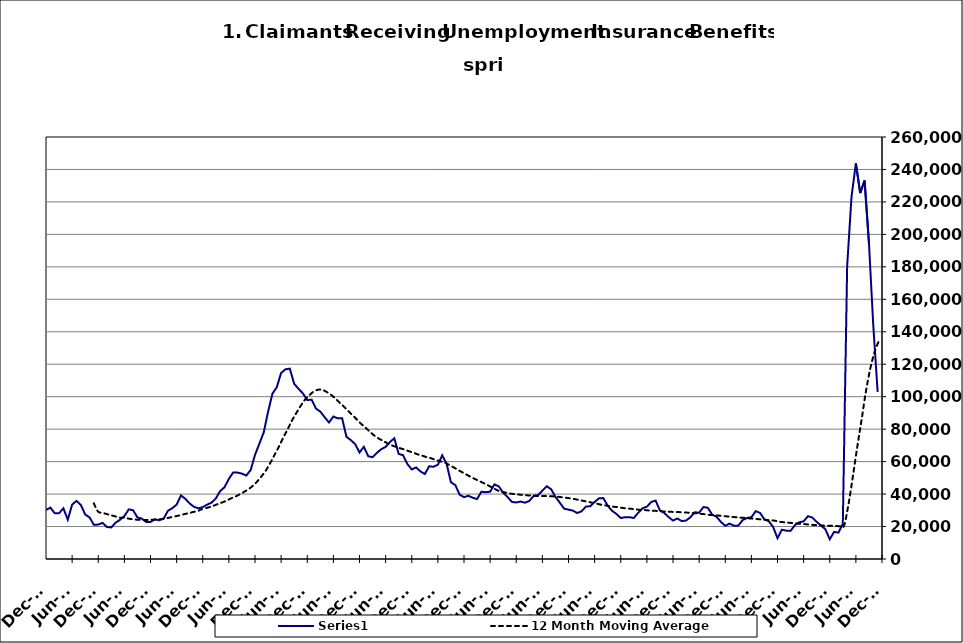
| Category | Series 0 |
|---|---|
| 2000-01-31 | 15239 |
| 2000-02-29 | 13995 |
| 2000-03-31 | 14536 |
| 2000-04-30 | 18337 |
| 2000-05-31 | 20863 |
| 2000-06-30 | 24310 |
| 2000-07-31 | 29359 |
| 2000-08-31 | 29764 |
| 2000-09-30 | 24540 |
| 2000-10-31 | 23067 |
| 2000-11-30 | 21129 |
| 2000-12-31 | 20288 |
| 2001-01-31 | 23646 |
| 2001-02-28 | 23782 |
| 2001-03-31 | 27047 |
| 2001-04-30 | 34048 |
| 2001-05-31 | 38168 |
| 2001-06-30 | 41894 |
| 2001-07-31 | 48114 |
| 2001-08-31 | 47646 |
| 2001-09-30 | 44132 |
| 2001-10-31 | 44465 |
| 2001-11-30 | 45928 |
| 2001-12-31 | 48930 |
| 2002-01-31 | 51864 |
| 2002-02-28 | 50778 |
| 2002-03-31 | 53014 |
| 2002-04-30 | 65394 |
| 2002-05-31 | 67925 |
| 2002-06-30 | 68727 |
| 2002-07-31 | 67269 |
| 2002-08-31 | 64233 |
| 2002-09-30 | 59955 |
| 2002-10-31 | 55535 |
| 2002-11-30 | 52233 |
| 2002-12-31 | 52252 |
| 2003-01-31 | 52694 |
| 2003-02-28 | 52578 |
| 2003-03-31 | 56236 |
| 2003-04-30 | 61020 |
| 2003-05-31 | 60584 |
| 2003-06-30 | 64980 |
| 2003-07-31 | 66426 |
| 2003-08-31 | 65403 |
| 2003-09-30 | 58348 |
| 2003-10-31 | 53953 |
| 2003-11-30 | 50453 |
| 2003-12-31 | 47799 |
| 2004-01-31 | 47134 |
| 2004-02-29 | 42441 |
| 2004-03-31 | 39363 |
| 2004-04-30 | 41157 |
| 2004-05-31 | 40892 |
| 2004-06-30 | 43601 |
| 2004-07-31 | 45411 |
| 2004-08-31 | 44738 |
| 2004-09-30 | 36049 |
| 2004-10-31 | 33551 |
| 2004-11-30 | 31386 |
| 2004-12-31 | 30195 |
| 2005-01-31 | 31661 |
| 2005-02-28 | 28205 |
| 2005-03-31 | 28194 |
| 2005-04-30 | 31233 |
| 2005-05-31 | 24184 |
| 2005-06-30 | 33525 |
| 2005-07-31 | 35776 |
| 2005-08-31 | 33297 |
| 2005-09-30 | 27423 |
| 2005-10-31 | 25647 |
| 2005-11-30 | 21039 |
| 2005-12-31 | 21238 |
| 2006-01-31 | 22270 |
| 2006-02-28 | 19689 |
| 2006-03-31 | 19474 |
| 2006-04-30 | 22420 |
| 2006-05-31 | 24146 |
| 2006-06-30 | 26450 |
| 2006-07-31 | 30575 |
| 2006-08-31 | 30038 |
| 2006-09-30 | 25657 |
| 2006-10-31 | 24869 |
| 2006-11-30 | 22832 |
| 2006-12-31 | 22826 |
| 2007-01-31 | 24459 |
| 2007-02-28 | 23856 |
| 2007-03-31 | 24786 |
| 2007-04-30 | 29690 |
| 2007-05-31 | 31303 |
| 2007-06-30 | 33512 |
| 2007-07-31 | 39176 |
| 2007-08-31 | 37077 |
| 2007-09-30 | 34179 |
| 2007-10-31 | 32130 |
| 2007-11-15 | 31205 |
| 2007-12-15 09:36:00 | 31973 |
| 2008-01-14 19:12:00 | 33494 |
| 2008-02-14 04:48:00 | 34694 |
| 2008-03-15 14:24:00 | 37279 |
| 2008-04-15 | 41840 |
| 2008-05-15 09:36:00 | 44245 |
| 2008-06-14 19:12:00 | 49341 |
| 2008-07-15 04:48:00 | 53353 |
| 2008-08-14 14:24:00 | 53222 |
| 2008-09-14 | 52594 |
| 2008-10-14 09:36:00 | 51417 |
| 2008-11-13 19:12:00 | 54795 |
| 2008-12-14 04:48:00 | 64139 |
| 2009-01-13 14:24:00 | 71026 |
| 2009-02-13 | 77947 |
| 2009-03-15 09:36:00 | 90649 |
| 2009-04-14 19:12:00 | 101865 |
| 2009-05-15 04:48:00 | 105867 |
| 2009-06-14 14:24:00 | 114626 |
| 2009-07-15 | 116882 |
| 2009-08-14 09:36:00 | 117270 |
| 2009-09-13 19:12:00 | 107943 |
| 2009-10-14 04:48:00 | 104849 |
| 2009-11-13 14:24:00 | 102065 |
| 2009-12-14 | 97917 |
| 2010-01-13 09:36:00 | 98175 |
| 2010-02-12 19:12:00 | 92691 |
| 2010-03-15 04:48:00 | 90832 |
| 2010-04-14 14:24:00 | 87347 |
| 2010-05-15 | 84120 |
| 2010-06-14 09:36:00 | 87787 |
| 2010-07-14 19:12:00 | 86654 |
| 2010-08-14 04:48:00 | 86789 |
| 2010-09-13 14:24:00 | 75317 |
| 2010-10-14 | 73259 |
| 2010-11-13 09:36:00 | 70783 |
| 2010-12-13 19:12:00 | 65644 |
| 2011-01-13 04:48:00 | 69106 |
| 2011-02-12 14:24:00 | 63322 |
| 2011-03-15 | 62724 |
| 2011-04-14 09:36:00 | 65434 |
| 2011-05-14 19:12:00 | 67641 |
| 2011-06-14 04:48:00 | 69087 |
| 2011-07-14 14:24:00 | 72082 |
| 2011-08-14 | 74376 |
| 2011-09-13 09:36:00 | 64739 |
| 2011-10-13 19:12:00 | 63965 |
| 2011-11-13 04:48:00 | 58496 |
| 2011-12-13 14:24:00 | 55173 |
| 2012-01-13 | 56418 |
| 2012-02-12 09:36:00 | 53942 |
| 2012-03-13 19:12:00 | 52352 |
| 2012-04-13 04:48:00 | 57118 |
| 2012-05-13 14:24:00 | 56827 |
| 2012-06-13 | 58115 |
| 2012-07-13 09:36:00 | 63863 |
| 2012-08-12 19:12:00 | 58706 |
| 2012-09-12 04:48:00 | 47243 |
| 2012-10-12 14:24:00 | 45567 |
| 2012-11-12 | 39623 |
| 2012-12-12 09:36:00 | 38101 |
| 2013-01-11 19:12:00 | 38966 |
| 2013-02-11 04:48:00 | 37746 |
| 2013-03-13 14:24:00 | 36956 |
| 2013-04-13 | 41439 |
| 2013-05-13 09:36:00 | 41162 |
| 2013-06-12 19:12:00 | 41455 |
| 2013-07-13 04:48:00 | 45989 |
| 2013-08-12 14:24:00 | 44712 |
| 2013-09-12 | 40828 |
| 2013-10-12 09:36:00 | 38185 |
| 2013-11-11 19:12:00 | 35184 |
| 2013-12-12 04:48:00 | 34824 |
| 2014-01-11 14:24:00 | 35396 |
| 2014-02-11 | 34683 |
| 2014-03-13 09:36:00 | 35748 |
| 2014-04-12 19:12:00 | 38892 |
| 2014-05-13 04:48:00 | 39325 |
| 2014-06-12 14:24:00 | 42091 |
| 2014-07-13 | 44842 |
| 2014-08-14 | 43016 |
| 2014-09-13 09:36:00 | 38304 |
| 2014-10-13 19:12:00 | 34708 |
| 2014-11-13 04:48:00 | 31017 |
| 2014-12-13 14:24:00 | 30402 |
| 2015-01-13 | 29823 |
| 2015-02-12 09:36:00 | 28333 |
| 2015-03-14 19:12:00 | 29389 |
| 2015-04-14 04:48:00 | 32293 |
| 2015-05-14 14:24:00 | 32538 |
| 2015-06-14 | 35137 |
| 2015-07-14 09:36:00 | 37398 |
| 2015-08-13 19:12:00 | 37536 |
| 2015-09-13 04:48:00 | 32808 |
| 2015-10-13 14:24:00 | 29728 |
| 2015-11-13 | 27775 |
| 2015-12-13 09:36:00 | 25227 |
| 2016-01-12 19:12:00 | 25773 |
| 2016-02-12 04:48:00 | 25758 |
| 2016-03-13 14:24:00 | 25247 |
| 2016-04-13 | 28463 |
| 2016-05-13 09:36:00 | 31210 |
| 2016-06-12 19:12:00 | 32255 |
| 2016-07-13 04:48:00 | 35088 |
| 2016-08-12 14:24:00 | 36018 |
| 2016-09-12 | 29922 |
| 2016-10-12 09:36:00 | 28368 |
| 2016-11-11 19:12:00 | 25818 |
| 2016-12-12 04:48:00 | 23690 |
| 2017-01-11 14:24:00 | 24964 |
| 2017-02-11 | 23348 |
| 2017-03-13 09:36:00 | 23685 |
| 2017-04-12 19:12:00 | 25733 |
| 2017-05-13 04:48:00 | 28796 |
| 2017-06-12 14:24:00 | 28489 |
| 2017-07-13 | 32034 |
| 2017-08-12 09:36:00 | 31539 |
| 2017-09-11 19:12:00 | 27321 |
| 2017-10-12 04:48:00 | 25990 |
| 2017-11-11 14:24:00 | 22875 |
| 2017-12-12 | 20445 |
| 2018-01-11 09:36:00 | 21794 |
| 2018-02-10 19:12:00 | 20475 |
| 2018-03-13 04:48:00 | 20585 |
| 2018-04-12 14:24:00 | 23969 |
| 2018-05-13 | 25280 |
| 2018-06-12 09:36:00 | 25741 |
| 2018-07-12 19:12:00 | 29479 |
| 2018-08-12 04:48:00 | 28351 |
| 2018-09-11 14:24:00 | 24386 |
| 2018-10-12 | 23292 |
| 2018-11-11 09:36:00 | 19711 |
| 2018-12-11 19:12:00 | 12853 |
| 2019-01-11 04:48:00 | 18039 |
| 2019-02-10 14:24:00 | 17466 |
| 2019-03-13 | 17325 |
| 2019-04-12 09:36:00 | 20890 |
| 2019-05-12 19:12:00 | 22641 |
| 2019-06-12 04:48:00 | 23178 |
| 2019-07-12 14:24:00 | 26385 |
| 2019-08-12 | 25501 |
| 2019-09-11 09:36:00 | 22892 |
| 2019-10-11 19:12:00 | 20585 |
| 2019-11-11 04:48:00 | 18323 |
| 2019-12-11 14:24:00 | 12174 |
| 2020-01-11 | 16684 |
| 2020-02-10 09:36:00 | 16260 |
| 2020-03-11 19:12:00 | 21667 |
| 2020-04-11 04:48:00 | 180666 |
| 2020-05-11 14:24:00 | 223189 |
| 2020-06-11 | 243809 |
| 2020-07-11 09:36:00 | 225469 |
| 2020-08-10 19:12:00 | 233220 |
| 2020-09-10 04:48:00 | 194839 |
| 2020-10-10 14:24:00 | 143722 |
| 2020-11-10 | 102967 |
| 2020-12-10 09:36:00 | 82367 |